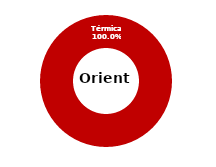
| Category | Oriente |
|---|---|
| Eólica | 0 |
| Hidráulica | 0 |
| Solar | 0 |
| Térmica | 44.245 |